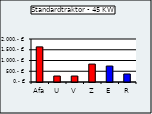
| Category | Standardtraktor - 45 KW |
|---|---|
| Afa | 1633.529 |
| U | 277.7 |
| V | 277.7 |
| Z | 833.1 |
| E | 742.56 |
| R | 373.229 |